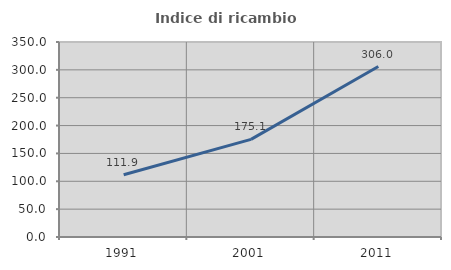
| Category | Indice di ricambio occupazionale  |
|---|---|
| 1991.0 | 111.853 |
| 2001.0 | 175.138 |
| 2011.0 | 305.996 |